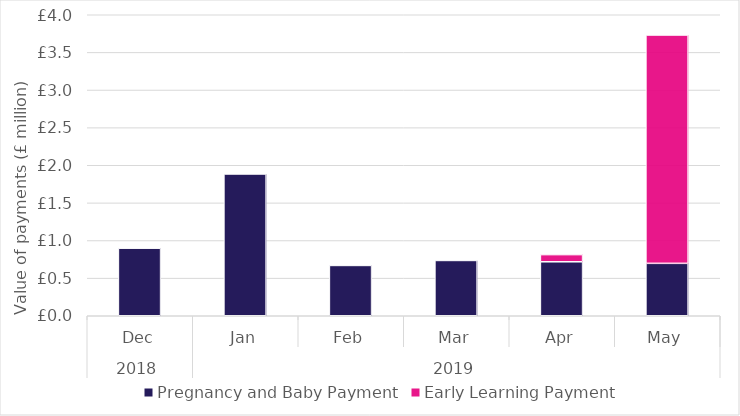
| Category | Pregnancy and Baby Payment | Early Learning Payment |
|---|---|---|
| 0 | 898200 | 0 |
| 1 | 1884000 | 0 |
| 2 | 668700 | 0 |
| 3 | 735000 | 0 |
| 4 | 717300 | 95250 |
| 5 | 696600 | 3034250 |